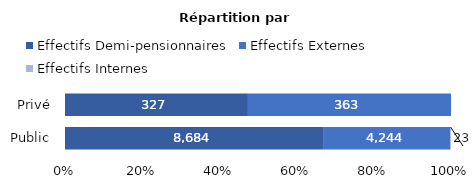
| Category | Effectifs Demi-pensionnaires | Effectifs Externes | Effectifs Internes |
|---|---|---|---|
| Public | 8684 | 4244 | 23 |
| Privé | 327 | 363 | 0 |